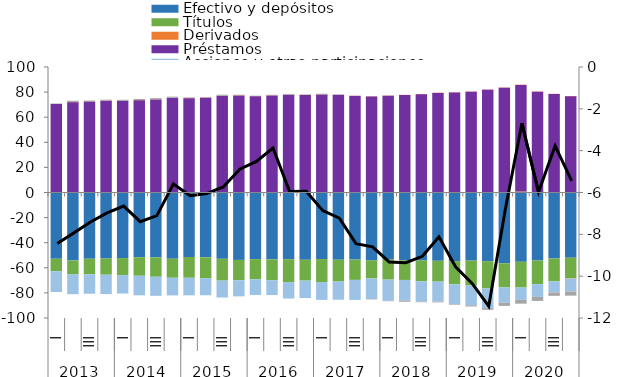
| Category | Efectivo y depósitos | Títulos | Derivados | Préstamos  | Acciones y otras participaciones  | Fondos de pensiones y seguros | Otras cuentas |
|---|---|---|---|---|---|---|---|
| 0 | -52.757 | -9.943 | 0.177 | 70.285 | -16.617 | 0.127 | 0.294 |
| 1 | -54.119 | -10.934 | 0.233 | 71.73 | -15.961 | 0.129 | 0.992 |
| 2 | -52.861 | -12.287 | 0.203 | 72.284 | -15.525 | 0.131 | 0.646 |
| 3 | -52.598 | -12.9 | 0.172 | 72.979 | -15.441 | 0.131 | 0.681 |
| 4 | -52.231 | -13.604 | 0.11 | 72.936 | -14.68 | 0.134 | 0.689 |
| 5 | -51.55 | -14.797 | 0.057 | 73.441 | -15.584 | 0.139 | 0.899 |
| 6 | -51.683 | -15.465 | 0.068 | 74.09 | -15.184 | 0.14 | 0.927 |
| 7 | -52.738 | -15.209 | 0.059 | 75.309 | -14.06 | 0.142 | 0.907 |
| 8 | -51.374 | -16.564 | 0.165 | 74.952 | -13.982 | 0.14 | 0.505 |
| 9 | -51.64 | -16.585 | 0.242 | 75.201 | -13.638 | 0.144 | 0.223 |
| 10 | -52.82 | -17.371 | 0.089 | 76.75 | -13.464 | 0.147 | 0.936 |
| 11 | -53.724 | -16.196 | 0.173 | 77.075 | -12.853 | 0.144 | 0.494 |
| 12 | -53.121 | -16.112 | 0.109 | 76.571 | -12.416 | 0.138 | 0.318 |
| 13 | -53.293 | -16.587 | 0.166 | 77.155 | -11.842 | 0.139 | 0.39 |
| 14 | -53.125 | -18.249 | 0.187 | 77.541 | -13.136 | 0.138 | 0.693 |
| 15 | -53.615 | -16.593 | 0.15 | 77.489 | -13.841 | 0.14 | 0.331 |
| 16 | -53.021 | -18.326 | 0.104 | 77.889 | -14.22 | 0.141 | 0.568 |
| 17 | -53.569 | -17.348 | 0.204 | 77.481 | -14.526 | 0.144 | 0.385 |
| 18 | -53.445 | -16.194 | 0.102 | 76.819 | -15.96 | 0.143 | 0.088 |
| 19 | -54.095 | -14.362 | -0.062 | 76.433 | -16.348 | 0.143 | -0.308 |
| 20 | -53.441 | -15.93 | -0.055 | 77.129 | -16.865 | 0.143 | -0.303 |
| 21 | -54.029 | -15.649 | 0.056 | 77.56 | -16.459 | 0.142 | -0.979 |
| 22 | -54.142 | -16.598 | 0.031 | 78.205 | -16.289 | 0.143 | -0.402 |
| 23 | -54.405 | -16.605 | 0.429 | 78.862 | -15.922 | 0.148 | -0.624 |
| 24 | -54.692 | -18.476 | 0.258 | 79.492 | -15.793 | 0.15 | -0.488 |
| 25 | -54.263 | -19.899 | 0.166 | 80.165 | -15.732 | 0.152 | -0.937 |
| 26 | -54.726 | -21.731 | 0.357 | 81.547 | -15.656 | 0.149 | -1.375 |
| 27 | -56.392 | -19.268 | 0.404 | 82.991 | -12.204 | 0.161 | -2.495 |
| 28 | -55.213 | -20.513 | 0.777 | 84.959 | -9.738 | 0.159 | -3.12 |
| 29 | -54.189 | -18.813 | 0.127 | 80.135 | -10.181 | 0.152 | -3.211 |
| 30 | -52.569 | -18.261 | 0.085 | 78.348 | -8.829 | 0.148 | -2.696 |
| 31 | -51.905 | -16.219 | -0.41 | 76.609 | -10.424 | 0.152 | -3.246 |